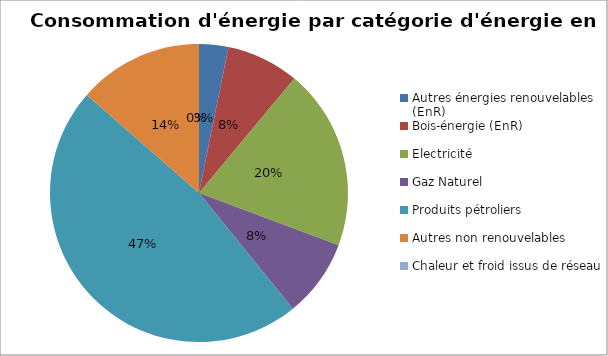
| Category | Series 0 |
|---|---|
| Autres énergies renouvelables (EnR) | 68280.718 |
| Bois-énergie (EnR) | 169418.133 |
| Electricité | 421910.157 |
| Gaz Naturel | 181864.898 |
| Produits pétroliers | 1016334.716 |
| Autres non renouvelables | 291525.049 |
| Chaleur et froid issus de réseau | 0 |